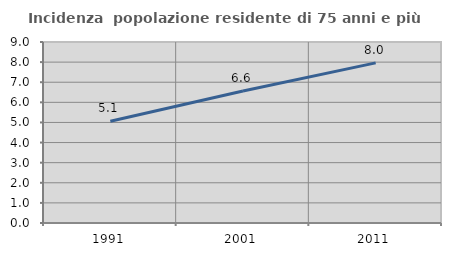
| Category | Incidenza  popolazione residente di 75 anni e più |
|---|---|
| 1991.0 | 5.057 |
| 2001.0 | 6.561 |
| 2011.0 | 7.962 |